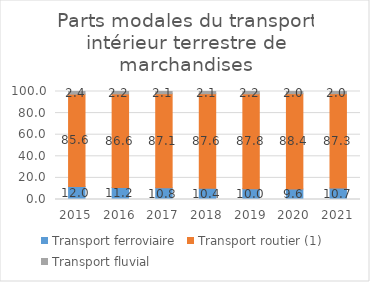
| Category | Transport ferroviaire | Transport routier (1) | Transport fluvial |
|---|---|---|---|
| 2015.0 | 11.952 | 85.606 | 2.442 |
| 2016.0 | 11.177 | 86.622 | 2.201 |
| 2017.0 | 10.837 | 87.112 | 2.052 |
| 2018.0 | 10.357 | 87.592 | 2.051 |
| 2019.0 | 10.026 | 87.797 | 2.176 |
| 2020.0 | 9.632 | 88.36 | 2.008 |
| 2021.0 | 10.687 | 87.286 | 2.027 |